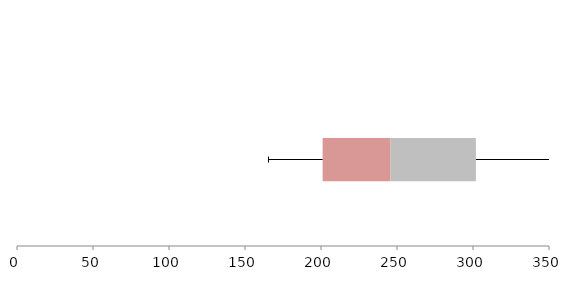
| Category | Series 1 | Series 2 | Series 3 |
|---|---|---|---|
| 0 | 201.072 | 44.694 | 56.149 |